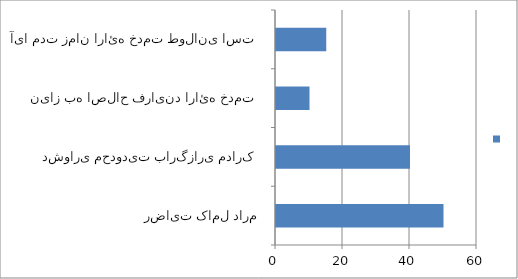
| Category | Series 0 |
|---|---|
| رضایت کامل دارم | 50 |
| دشواری محدودیت بارگزاری مدارک | 40 |
| نیاز به اصلاح فرایند ارائه خدمت | 10 |
| آیا مدت زمان ارائه خدمت طولانی است | 15 |